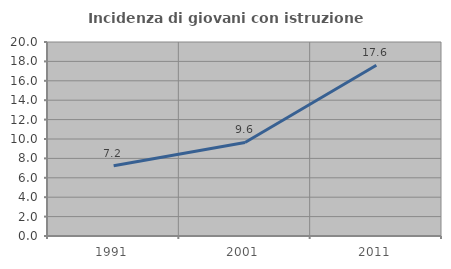
| Category | Incidenza di giovani con istruzione universitaria |
|---|---|
| 1991.0 | 7.237 |
| 2001.0 | 9.642 |
| 2011.0 | 17.603 |